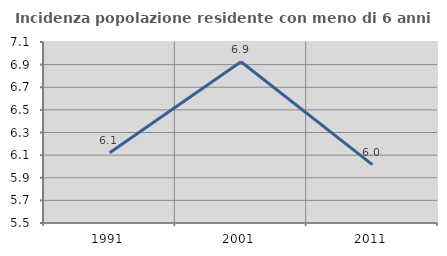
| Category | Incidenza popolazione residente con meno di 6 anni |
|---|---|
| 1991.0 | 6.12 |
| 2001.0 | 6.925 |
| 2011.0 | 6.016 |